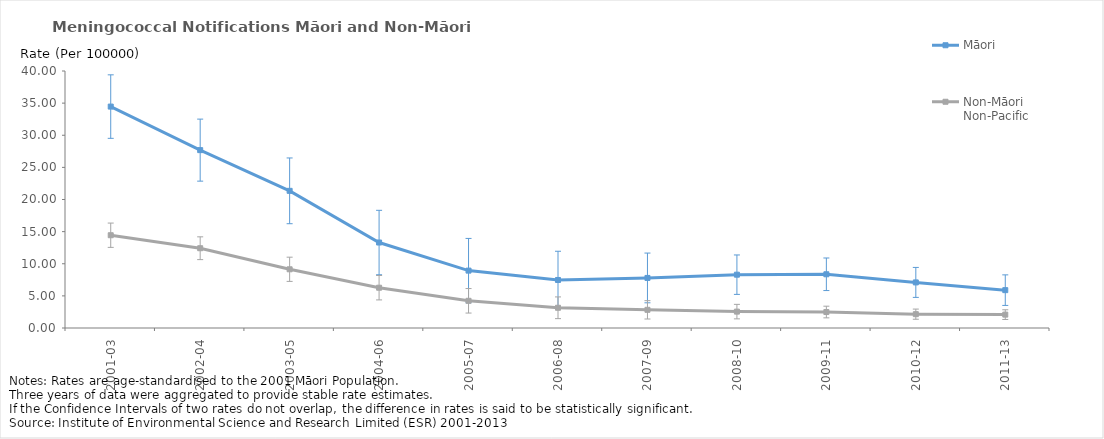
| Category | Māori | Non-Māori Non-Pacific |
|---|---|---|
| 2001-03 | 34.461 | 14.439 |
| 2002-04 | 27.683 | 12.416 |
| 2003-05 | 21.349 | 9.137 |
| 2004-06 | 13.303 | 6.272 |
| 2005-07 | 8.932 | 4.234 |
| 2006-08 | 7.475 | 3.149 |
| 2007-09 | 7.792 | 2.829 |
| 2008-10 | 8.299 | 2.55 |
| 2009-11 | 8.362 | 2.487 |
| 2010-12 | 7.095 | 2.153 |
| 2011-13 | 5.891 | 2.082 |